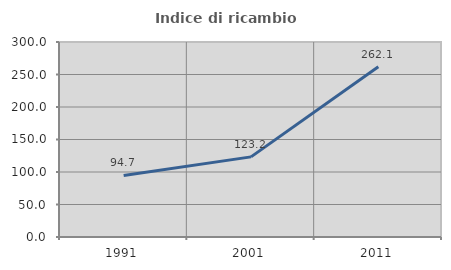
| Category | Indice di ricambio occupazionale  |
|---|---|
| 1991.0 | 94.664 |
| 2001.0 | 123.249 |
| 2011.0 | 262.054 |